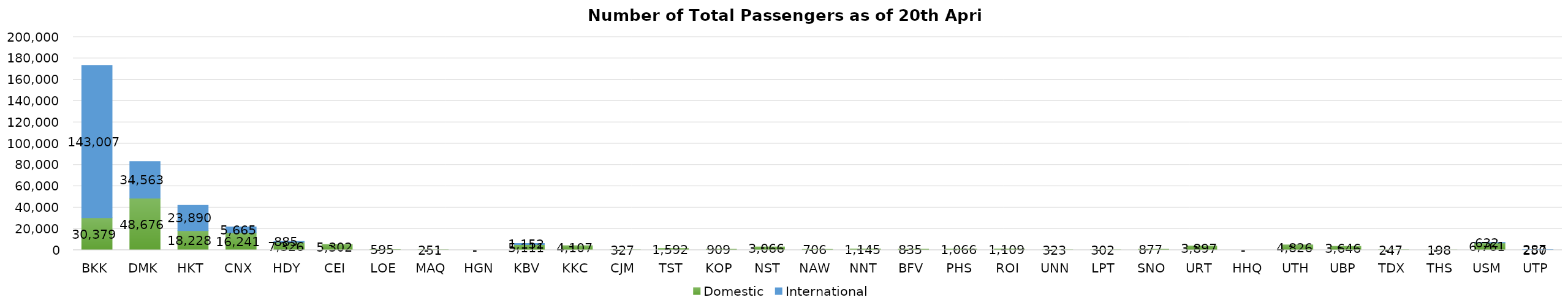
| Category | Domestic | International |
|---|---|---|
| BKK | 30379 | 143007 |
| DMK | 48676 | 34563 |
| HKT | 18228 | 23890 |
| CNX | 16241 | 5665 |
| HDY | 7326 | 885 |
| CEI | 5302 | 0 |
| LOE | 595 | 0 |
| MAQ | 251 | 0 |
| HGN | 0 | 0 |
| KBV | 5111 | 1152 |
| KKC | 4107 | 0 |
| CJM | 327 | 0 |
| TST | 1592 | 0 |
| KOP | 909 | 0 |
| NST | 3066 | 0 |
| NAW | 706 | 0 |
| NNT | 1145 | 0 |
| BFV | 835 | 0 |
| PHS | 1066 | 0 |
| ROI | 1109 | 0 |
| UNN | 323 | 0 |
| LPT | 302 | 0 |
| SNO | 877 | 0 |
| URT | 3897 | 0 |
| HHQ | 0 | 0 |
| UTH | 4826 | 0 |
| UBP | 3646 | 0 |
| TDX | 247 | 0 |
| THS | 198 | 0 |
| USM | 6761 | 632 |
| UTP | 250 | 287 |